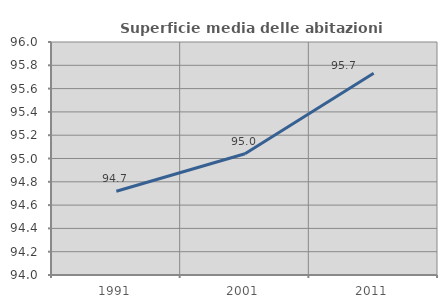
| Category | Superficie media delle abitazioni occupate |
|---|---|
| 1991.0 | 94.719 |
| 2001.0 | 95.041 |
| 2011.0 | 95.733 |